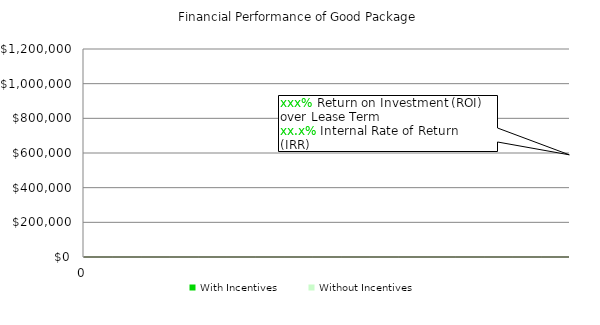
| Category | Year | With Incentives | Without Incentives |
|---|---|---|---|
| 0 | 0 | 0 | 0 |